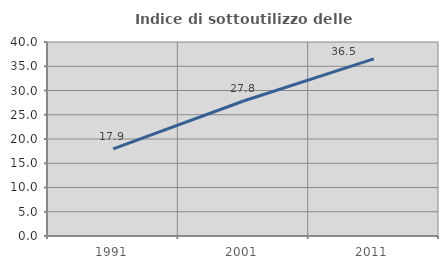
| Category | Indice di sottoutilizzo delle abitazioni  |
|---|---|
| 1991.0 | 17.949 |
| 2001.0 | 27.829 |
| 2011.0 | 36.529 |